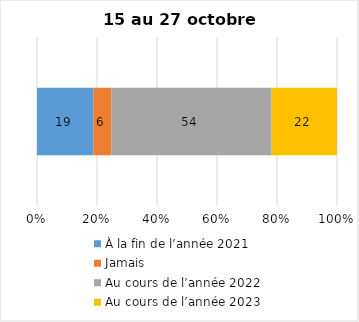
| Category | À la fin de l’année 2021 | Jamais | Au cours de l’année 2022 | Au cours de l’année 2023 |
|---|---|---|---|---|
| 0 | 19 | 6 | 54 | 22 |